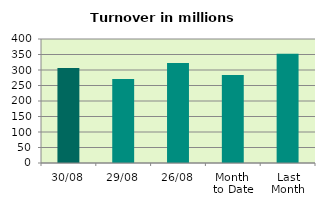
| Category | Series 0 |
|---|---|
| 30/08 | 306.211 |
| 29/08 | 270.603 |
| 26/08 | 322.398 |
| Month 
to Date | 284.137 |
| Last
Month | 352.063 |